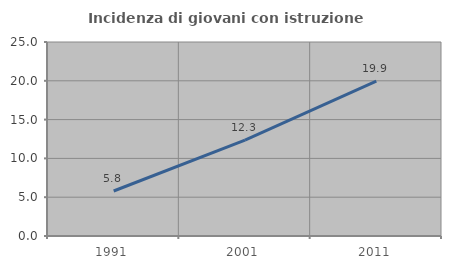
| Category | Incidenza di giovani con istruzione universitaria |
|---|---|
| 1991.0 | 5.802 |
| 2001.0 | 12.348 |
| 2011.0 | 19.948 |